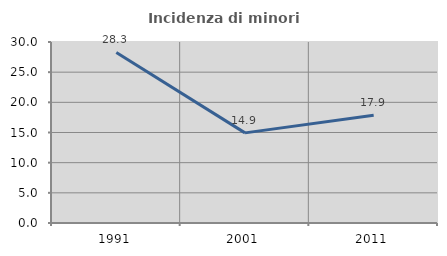
| Category | Incidenza di minori stranieri |
|---|---|
| 1991.0 | 28.261 |
| 2001.0 | 14.938 |
| 2011.0 | 17.853 |